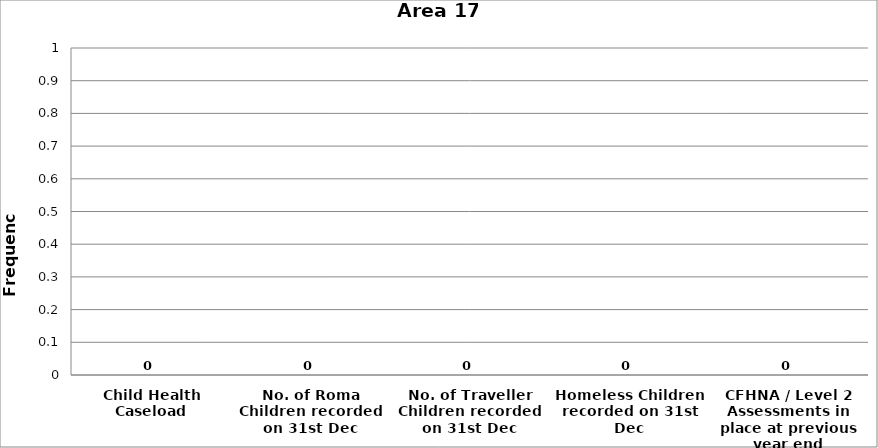
| Category | Area 17 |
|---|---|
| Child Health Caseload | 0 |
| No. of Roma Children recorded on 31st Dec | 0 |
| No. of Traveller Children recorded on 31st Dec | 0 |
| Homeless Children recorded on 31st Dec | 0 |
| CFHNA / Level 2 Assessments in place at previous year end | 0 |